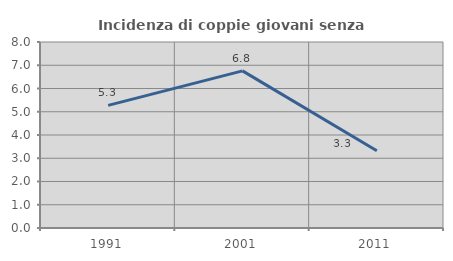
| Category | Incidenza di coppie giovani senza figli |
|---|---|
| 1991.0 | 5.275 |
| 2001.0 | 6.757 |
| 2011.0 | 3.32 |